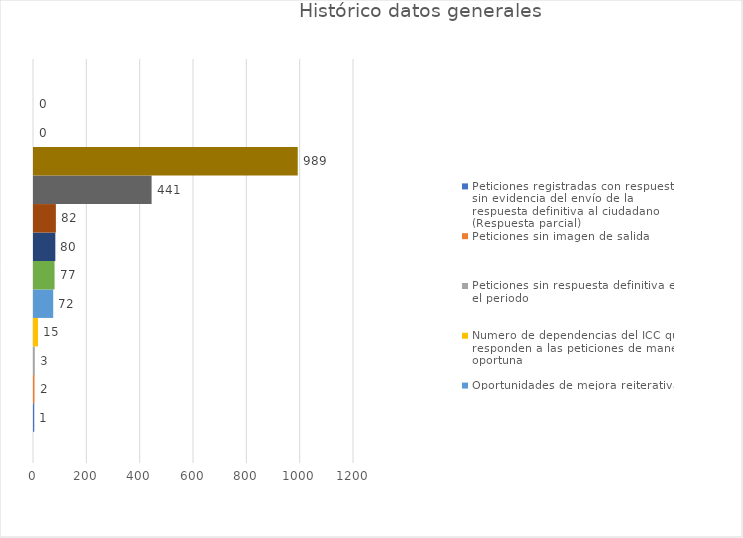
| Category | Peticiones registradas con respuesta, sin evidencia del envío de la respuesta definitiva al ciudadano (Respuesta parcial) | Peticiones sin imagen de salida | Peticiones sin respuesta definitiva en el periodo | Numero de dependencias del ICC que responden a las peticiones de manera oportuna | Oportunidades de mejora reiterativas | Peticiones con respuestas evidenciadas | Muestreo de respuestas | Muestreo de categorización | Peticiones recibidas | Comunicaciones recibidas | Peticiones sin radicar | Peticiones radicadas durante el periodo anterior, sin responder a la fecha de corte del periodo en revisión |
|---|---|---|---|---|---|---|---|---|---|---|---|---|
| CANTIDAD | 1 | 2 | 3 | 15 | 72 | 77 | 80 | 82 | 441 | 989 | 0 | 0 |